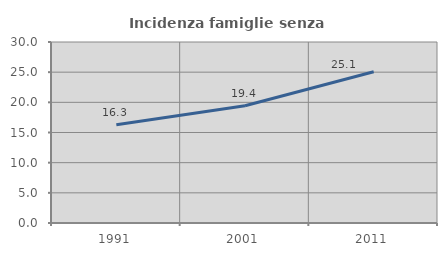
| Category | Incidenza famiglie senza nuclei |
|---|---|
| 1991.0 | 16.272 |
| 2001.0 | 19.438 |
| 2011.0 | 25.07 |